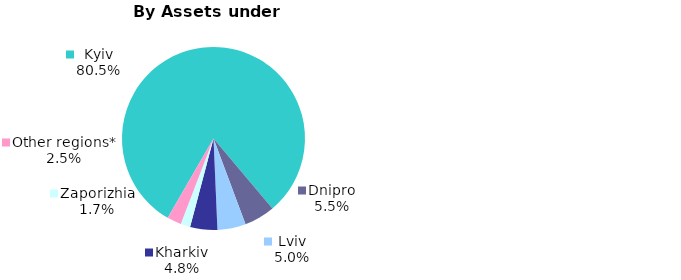
| Category | Series 0 |
|---|---|
| Kyiv | 0.805 |
| Dnipro | 0.055 |
| Lviv | 0.05 |
| Kharkiv | 0.048 |
| Zaporizhia | 0.017 |
| Other regions* | 0.025 |